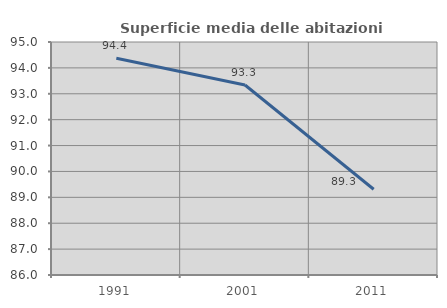
| Category | Superficie media delle abitazioni occupate |
|---|---|
| 1991.0 | 94.375 |
| 2001.0 | 93.338 |
| 2011.0 | 89.312 |